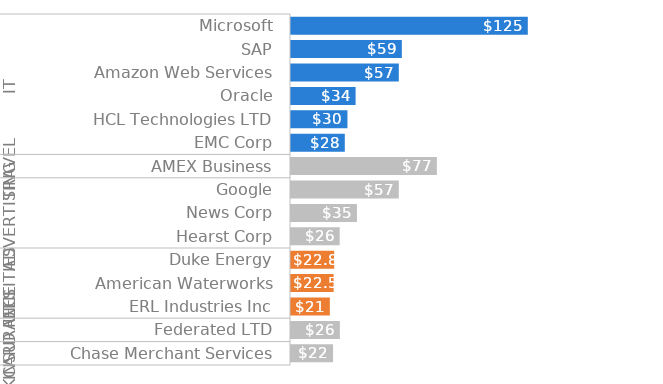
| Category | SPEND ($K) |
|---|---|
| 0 | 125 |
| 1 | 58.5 |
| 2 | 56.9 |
| 3 | 34.1 |
| 4 | 29.8 |
| 5 | 28.4 |
| 6 | 77 |
| 7 | 56.9 |
| 8 | 34.8 |
| 9 | 25.7 |
| 10 | 22.8 |
| 11 | 22.5 |
| 12 | 20.5 |
| 13 | 25.8 |
| 14 | 22.2 |